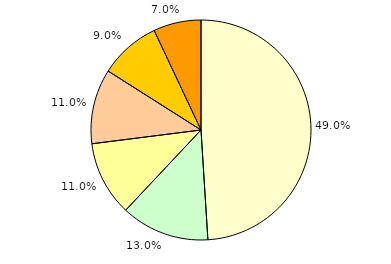
| Category | Series 0 |
|---|---|
| unter 3 Jahre | 49 |
| 3 bis unter 6 Jahre | 13 |
| 6 bis unter 9 Jahre | 11 |
| 9 bis unter 12 Jahre | 11 |
| 12 bis unter 15 Jahre | 9 |
| 15 bis unter 18 Jahre | 7 |